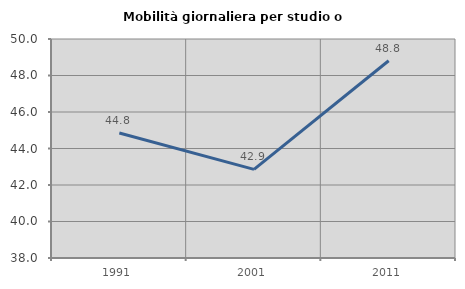
| Category | Mobilità giornaliera per studio o lavoro |
|---|---|
| 1991.0 | 44.847 |
| 2001.0 | 42.857 |
| 2011.0 | 48.81 |